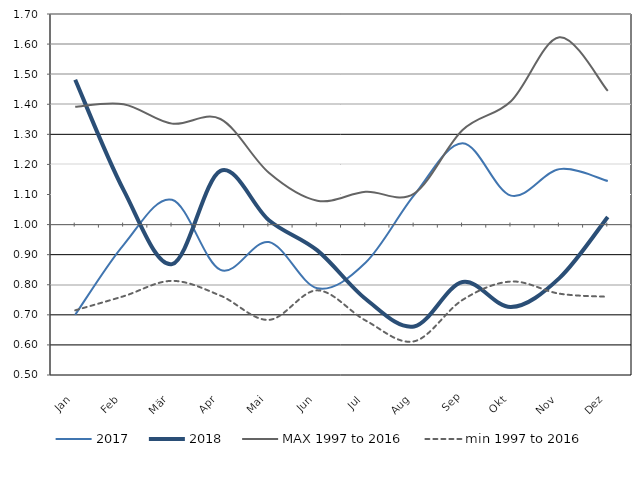
| Category | 2017 | 2018 | MAX 1997 to 2016 | min 1997 to 2016 |
|---|---|---|---|---|
| Jan | 0.7 | 1.482 | 1.392 | 0.715 |
| Feb | 0.933 | 1.114 | 1.4 | 0.762 |
| Mär | 1.082 | 0.869 | 1.336 | 0.813 |
| Apr | 0.849 | 1.178 | 1.351 | 0.764 |
| Mai | 0.942 | 1.015 | 1.172 | 0.683 |
| Jun | 0.788 | 0.914 | 1.079 | 0.781 |
| Jul | 0.874 | 0.753 | 1.109 | 0.681 |
| Aug | 1.098 | 0.661 | 1.103 | 0.612 |
| Sep | 1.27 | 0.809 | 1.314 | 0.75 |
| Okt | 1.096 | 0.726 | 1.41 | 0.811 |
| Nov | 1.184 | 0.822 | 1.622 | 0.77 |
| Dez | 1.145 | 1.026 | 1.444 | 0.76 |